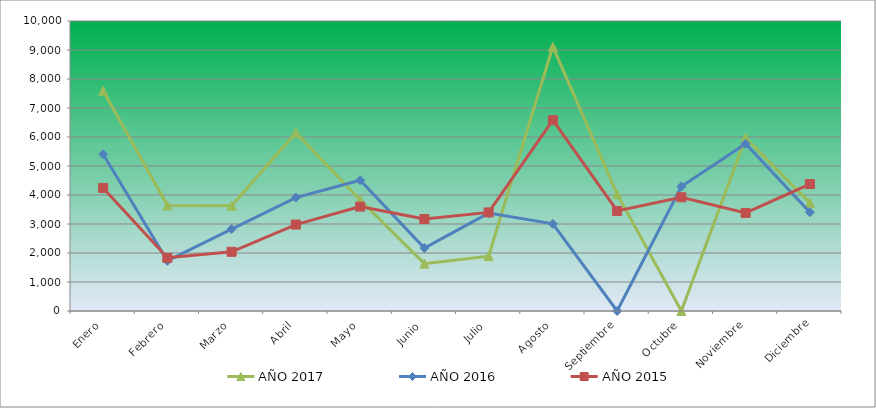
| Category | AÑO 2017 | AÑO 2016 | AÑO 2015 |
|---|---|---|---|
| Enero | 7596.832 | 5405.698 | 4242.577 |
| Febrero | 3638.749 | 1729.715 | 1834.914 |
| Marzo | 3629.224 | 2824.487 | 2040.972 |
| Abril | 6147.433 | 3909.615 | 2979.854 |
| Mayo | 3829.26 | 4510.615 | 3600.049 |
| Junio | 1633.467 | 2171.43 | 3171.865 |
| Julio | 1892.392 | 3375.559 | 3400.557 |
| Agosto | 9115.735 | 3003.835 | 6581.992 |
| Septiembre | 4029.084 | 0 | 3450.273 |
| Octubre | 0 | 4293.474 | 3921.313 |
| Noviembre | 5968.418 | 5769.733 | 3380.671 |
| Diciembre | 3734.005 | 3408.392 | 4377.599 |